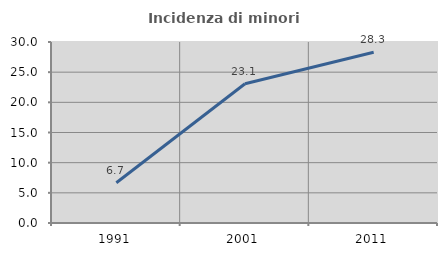
| Category | Incidenza di minori stranieri |
|---|---|
| 1991.0 | 6.667 |
| 2001.0 | 23.077 |
| 2011.0 | 28.313 |